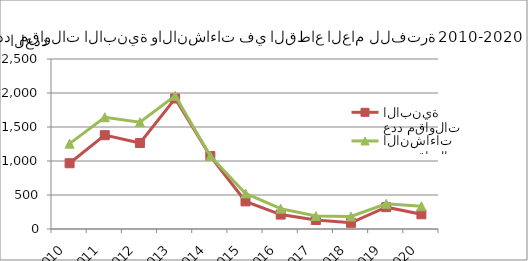
| Category | عدد مقاولات الابنية | عدد مقاولات الانشاءات |
|---|---|---|
| 2010.0 | 967 | 1255 |
| 2011.0 | 1380 | 1644 |
| 2012.0 | 1265 | 1570 |
| 2013.0 | 1919 | 1959 |
| 2014.0 | 1073 | 1073 |
| 2015.0 | 406 | 523 |
| 2016.0 | 212 | 299 |
| 2017.0 | 132 | 191 |
| 2018.0 | 91 | 184 |
| 2019.0 | 321 | 370 |
| 2020.0 | 216 | 335 |